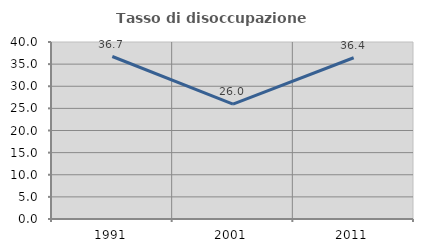
| Category | Tasso di disoccupazione giovanile  |
|---|---|
| 1991.0 | 36.723 |
| 2001.0 | 25.969 |
| 2011.0 | 36.435 |